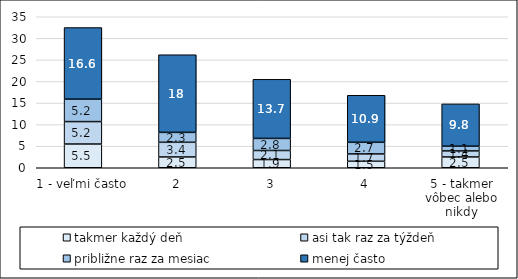
| Category | takmer každý deň | asi tak raz za týždeň | približne raz za mesiac | menej často |
|---|---|---|---|---|
| 1 - veľmi často | 5.5 | 5.2 | 5.2 | 16.6 |
| 2 | 2.5 | 3.4 | 2.3 | 18 |
| 3 | 1.9 | 2.1 | 2.8 | 13.7 |
| 4 | 1.5 | 1.7 | 2.7 | 10.9 |
| 5 - takmer vôbec alebo nikdy | 2.5 | 1.4 | 1.1 | 9.8 |